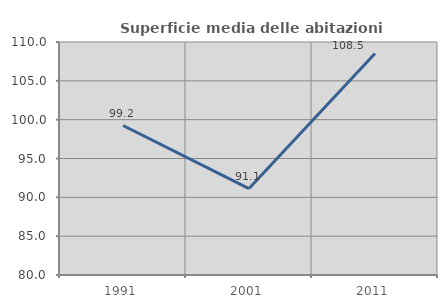
| Category | Superficie media delle abitazioni occupate |
|---|---|
| 1991.0 | 99.245 |
| 2001.0 | 91.126 |
| 2011.0 | 108.524 |